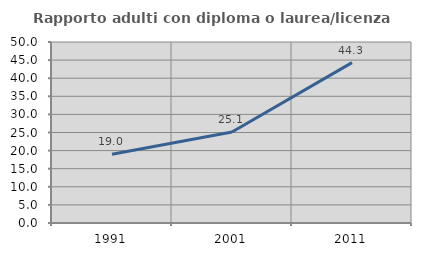
| Category | Rapporto adulti con diploma o laurea/licenza media  |
|---|---|
| 1991.0 | 19.008 |
| 2001.0 | 25.15 |
| 2011.0 | 44.304 |